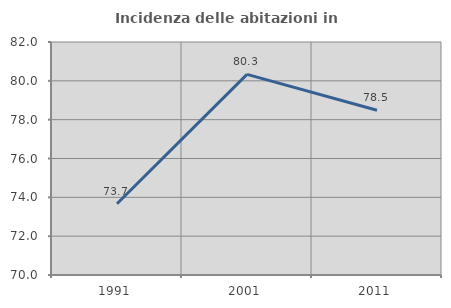
| Category | Incidenza delle abitazioni in proprietà  |
|---|---|
| 1991.0 | 73.667 |
| 2001.0 | 80.333 |
| 2011.0 | 78.485 |